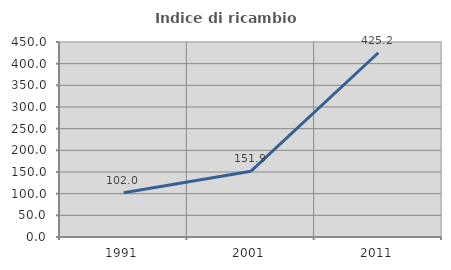
| Category | Indice di ricambio occupazionale  |
|---|---|
| 1991.0 | 101.97 |
| 2001.0 | 151.875 |
| 2011.0 | 425.225 |